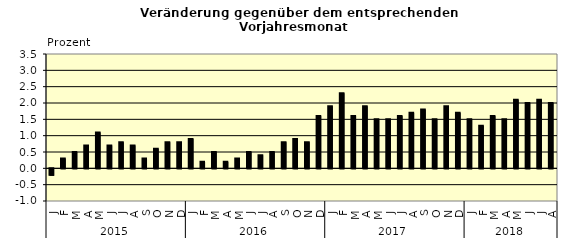
| Category | Series 0 |
|---|---|
| 0 | -0.2 |
| 1 | 0.3 |
| 2 | 0.5 |
| 3 | 0.7 |
| 4 | 1.1 |
| 5 | 0.7 |
| 6 | 0.8 |
| 7 | 0.7 |
| 8 | 0.3 |
| 9 | 0.6 |
| 10 | 0.8 |
| 11 | 0.8 |
| 12 | 0.9 |
| 13 | 0.2 |
| 14 | 0.5 |
| 15 | 0.2 |
| 16 | 0.3 |
| 17 | 0.5 |
| 18 | 0.4 |
| 19 | 0.5 |
| 20 | 0.8 |
| 21 | 0.9 |
| 22 | 0.8 |
| 23 | 1.6 |
| 24 | 1.9 |
| 25 | 2.3 |
| 26 | 1.6 |
| 27 | 1.9 |
| 28 | 1.5 |
| 29 | 1.5 |
| 30 | 1.6 |
| 31 | 1.7 |
| 32 | 1.8 |
| 33 | 1.5 |
| 34 | 1.9 |
| 35 | 1.7 |
| 36 | 1.5 |
| 37 | 1.3 |
| 38 | 1.6 |
| 39 | 1.5 |
| 40 | 2.1 |
| 41 | 2 |
| 42 | 2.1 |
| 43 | 2 |